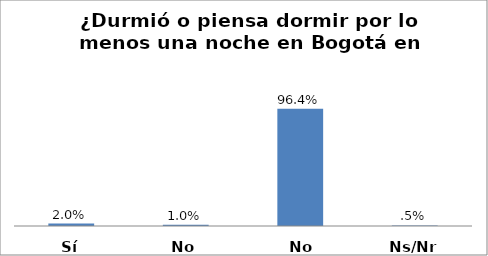
| Category | Series 0 |
|---|---|
| Sí | 0.02 |
| No | 0.01 |
| No aplica | 0.964 |
| Ns/Nr | 0.005 |